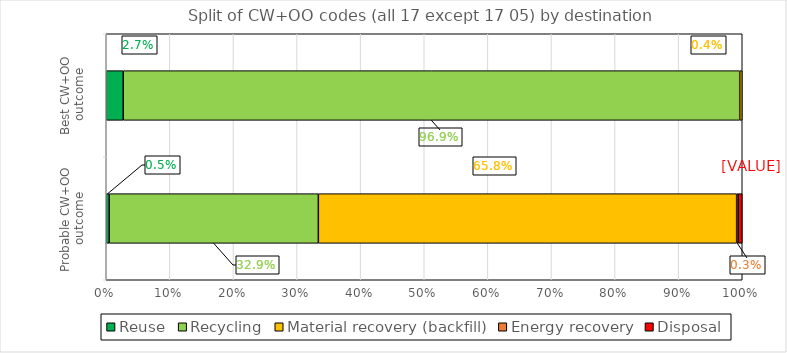
| Category | Reuse | Recycling | Material recovery (backfill) | Energy recovery | Disposal |
|---|---|---|---|---|---|
| Probable CW+OO outcome | 0.005 | 0.329 | 0.658 | 0.003 | 0.006 |
| Best CW+OO outcome | 0.027 | 0.969 | 0.004 | 0 | 0 |